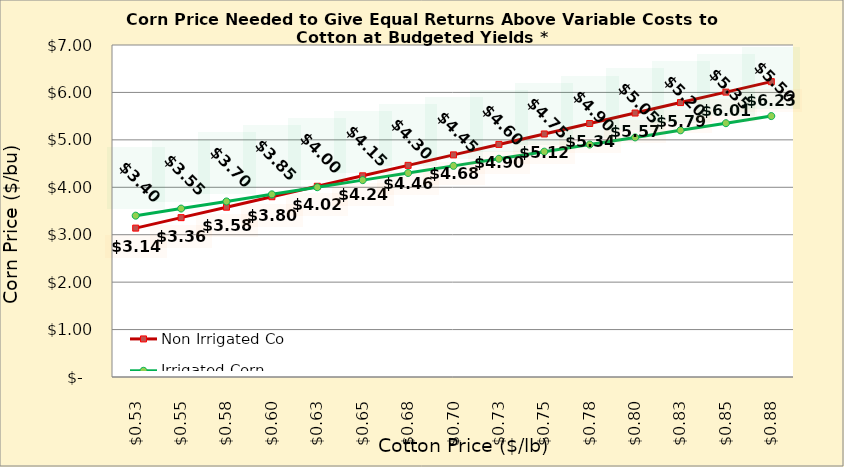
| Category | Non Irrigated Corn | Irrigated Corn |
|---|---|---|
| 0.5249999999999998 | 3.139 | 3.401 |
| 0.5499999999999998 | 3.36 | 3.551 |
| 0.5749999999999998 | 3.58 | 3.701 |
| 0.5999999999999999 | 3.801 | 3.851 |
| 0.6249999999999999 | 4.021 | 4.001 |
| 0.6499999999999999 | 4.242 | 4.151 |
| 0.6749999999999999 | 4.463 | 4.301 |
| 0.7 | 4.683 | 4.451 |
| 0.725 | 4.904 | 4.601 |
| 0.75 | 5.124 | 4.751 |
| 0.775 | 5.345 | 4.901 |
| 0.8 | 5.566 | 5.051 |
| 0.8250000000000001 | 5.786 | 5.201 |
| 0.8500000000000001 | 6.007 | 5.351 |
| 0.8750000000000001 | 6.227 | 5.501 |